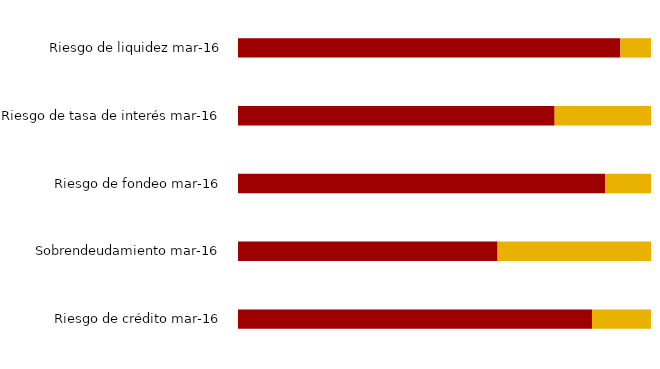
| Category | Controlado | Afecta las operaciones de la entidad |
|---|---|---|
| Riesgo de crédito mar-16 | 0.857 | 0.143 |
| Sobrendeudamiento mar-16 | 0.629 | 0.371 |
| Riesgo de fondeo mar-16 | 0.889 | 0.111 |
| Riesgo de tasa de interés mar-16 | 0.767 | 0.233 |
| Riesgo de liquidez mar-16 | 0.926 | 0.074 |